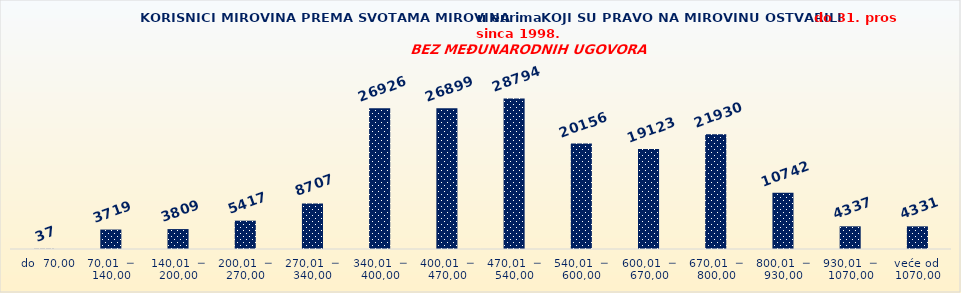
| Category | Series 0 |
|---|---|
|   do  70,00 | 37 |
| 70,01  ─  140,00 | 3719 |
| 140,01  ─  200,00 | 3809 |
| 200,01  ─  270,00 | 5417 |
| 270,01  ─  340,00 | 8707 |
| 340,01  ─  400,00 | 26926 |
| 400,01  ─  470,00 | 26899 |
| 470,01  ─  540,00 | 28794 |
| 540,01  ─  600,00 | 20156 |
| 600,01  ─  670,00 | 19123 |
| 670,01  ─  800,00 | 21930 |
| 800,01  ─  930,00 | 10742 |
| 930,01  ─  1070,00 | 4337 |
| veće od  1070,00 | 4331 |